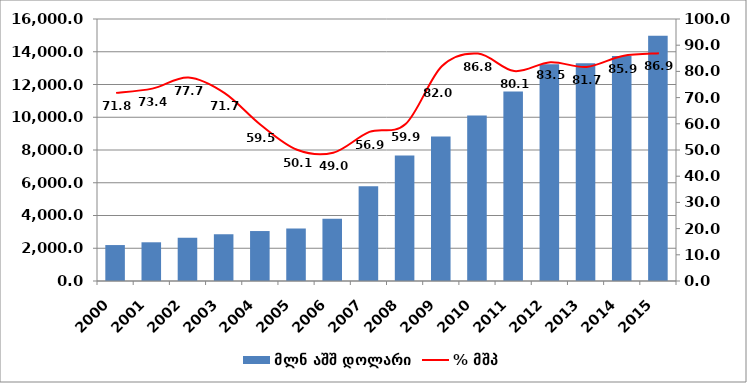
| Category | მლნ აშშ დოლარი |
|---|---|
| 2000.0 | 2195.069 |
| 2001.0 | 2364.019 |
| 2002.0 | 2638.739 |
| 2003.0 | 2861.027 |
| 2004.0 | 3050.926 |
| 2005.0 | 3210.442 |
| 2006.0 | 3800.544 |
| 2007.0 | 5790.241 |
| 2008.0 | 7667.716 |
| 2009.0 | 8826.472 |
| 2010.0 | 10102.737 |
| 2011.0 | 11578.652 |
| 2012.0 | 13242.811 |
| 2013.0 | 13290.082 |
| 2014.0 | 13739.705 |
| 2015.0 | 14973.923 |